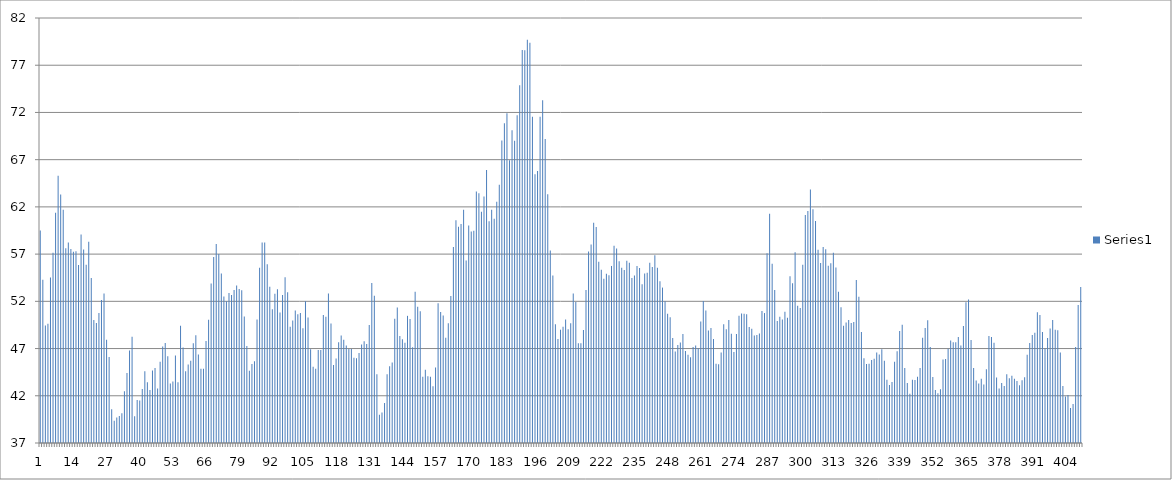
| Category | Series 0 |
|---|---|
| 0 | 59.508 |
| 1 | 54.296 |
| 2 | 49.432 |
| 3 | 49.633 |
| 4 | 54.536 |
| 5 | 57.152 |
| 6 | 61.379 |
| 7 | 65.297 |
| 8 | 63.302 |
| 9 | 61.707 |
| 10 | 57.632 |
| 11 | 58.221 |
| 12 | 57.54 |
| 13 | 57.25 |
| 14 | 57.297 |
| 15 | 55.84 |
| 16 | 59.066 |
| 17 | 57.5 |
| 18 | 55.879 |
| 19 | 58.316 |
| 20 | 54.482 |
| 21 | 50.033 |
| 22 | 49.706 |
| 23 | 50.762 |
| 24 | 52.151 |
| 25 | 52.82 |
| 26 | 47.924 |
| 27 | 46.106 |
| 28 | 40.566 |
| 29 | 39.352 |
| 30 | 39.703 |
| 31 | 39.866 |
| 32 | 40.151 |
| 33 | 42.467 |
| 34 | 44.4 |
| 35 | 46.794 |
| 36 | 48.237 |
| 37 | 39.843 |
| 38 | 41.554 |
| 39 | 41.513 |
| 40 | 42.717 |
| 41 | 44.608 |
| 42 | 43.44 |
| 43 | 42.617 |
| 44 | 44.688 |
| 45 | 44.942 |
| 46 | 42.781 |
| 47 | 45.613 |
| 48 | 47.226 |
| 49 | 47.598 |
| 50 | 46.19 |
| 51 | 43.303 |
| 52 | 43.502 |
| 53 | 46.257 |
| 54 | 43.425 |
| 55 | 49.404 |
| 56 | 47.113 |
| 57 | 44.584 |
| 58 | 45.314 |
| 59 | 45.72 |
| 60 | 47.567 |
| 61 | 48.42 |
| 62 | 46.383 |
| 63 | 44.871 |
| 64 | 44.873 |
| 65 | 47.792 |
| 66 | 50.044 |
| 67 | 53.888 |
| 68 | 56.682 |
| 69 | 58.061 |
| 70 | 57.01 |
| 71 | 54.937 |
| 72 | 52.513 |
| 73 | 52 |
| 74 | 52.88 |
| 75 | 52.667 |
| 76 | 53.192 |
| 77 | 53.684 |
| 78 | 53.305 |
| 79 | 53.161 |
| 80 | 50.381 |
| 81 | 47.28 |
| 82 | 44.662 |
| 83 | 45.36 |
| 84 | 45.647 |
| 85 | 50.073 |
| 86 | 55.546 |
| 87 | 58.233 |
| 88 | 58.242 |
| 89 | 55.933 |
| 90 | 53.532 |
| 91 | 51.174 |
| 92 | 52.815 |
| 93 | 53.286 |
| 94 | 50.81 |
| 95 | 52.676 |
| 96 | 54.55 |
| 97 | 52.969 |
| 98 | 49.314 |
| 99 | 49.959 |
| 100 | 51.023 |
| 101 | 50.641 |
| 102 | 50.776 |
| 103 | 49.14 |
| 104 | 51.996 |
| 105 | 50.294 |
| 106 | 46.938 |
| 107 | 45.064 |
| 108 | 44.87 |
| 109 | 46.834 |
| 110 | 46.857 |
| 111 | 50.547 |
| 112 | 50.359 |
| 113 | 52.828 |
| 114 | 49.662 |
| 115 | 45.266 |
| 116 | 45.947 |
| 117 | 47.674 |
| 118 | 48.373 |
| 119 | 47.928 |
| 120 | 47.312 |
| 121 | 46.945 |
| 122 | 46.944 |
| 123 | 46.028 |
| 124 | 45.978 |
| 125 | 46.525 |
| 126 | 47.442 |
| 127 | 47.783 |
| 128 | 47.494 |
| 129 | 49.491 |
| 130 | 53.952 |
| 131 | 52.594 |
| 132 | 44.28 |
| 133 | 39.992 |
| 134 | 40.225 |
| 135 | 41.248 |
| 136 | 44.273 |
| 137 | 45.136 |
| 138 | 45.523 |
| 139 | 50.16 |
| 140 | 51.351 |
| 141 | 48.339 |
| 142 | 47.974 |
| 143 | 47.608 |
| 144 | 50.464 |
| 145 | 50.127 |
| 146 | 47.131 |
| 147 | 53.003 |
| 148 | 51.416 |
| 149 | 50.958 |
| 150 | 44.017 |
| 151 | 44.754 |
| 152 | 44.058 |
| 153 | 44.005 |
| 154 | 43.001 |
| 155 | 45.004 |
| 156 | 51.8 |
| 157 | 50.864 |
| 158 | 50.513 |
| 159 | 48.15 |
| 160 | 49.666 |
| 161 | 52.564 |
| 162 | 57.76 |
| 163 | 60.595 |
| 164 | 59.898 |
| 165 | 60.19 |
| 166 | 61.686 |
| 167 | 56.33 |
| 168 | 60.032 |
| 169 | 59.396 |
| 170 | 59.481 |
| 171 | 63.618 |
| 172 | 63.436 |
| 173 | 61.475 |
| 174 | 63.099 |
| 175 | 65.894 |
| 176 | 60.488 |
| 177 | 61.696 |
| 178 | 60.739 |
| 179 | 62.553 |
| 180 | 64.344 |
| 181 | 69.018 |
| 182 | 70.846 |
| 183 | 71.921 |
| 184 | 66.927 |
| 185 | 70.102 |
| 186 | 69 |
| 187 | 71.699 |
| 188 | 74.874 |
| 189 | 78.617 |
| 190 | 78.586 |
| 191 | 79.688 |
| 192 | 79.383 |
| 193 | 71.554 |
| 194 | 65.457 |
| 195 | 65.802 |
| 196 | 71.532 |
| 197 | 73.292 |
| 198 | 69.198 |
| 199 | 63.347 |
| 200 | 57.392 |
| 201 | 54.733 |
| 202 | 49.565 |
| 203 | 48.005 |
| 204 | 48.996 |
| 205 | 49.316 |
| 206 | 50.082 |
| 207 | 49.034 |
| 208 | 49.674 |
| 209 | 52.82 |
| 210 | 51.937 |
| 211 | 47.574 |
| 212 | 47.566 |
| 213 | 48.956 |
| 214 | 53.21 |
| 215 | 57.278 |
| 216 | 58.018 |
| 217 | 60.314 |
| 218 | 59.863 |
| 219 | 56.184 |
| 220 | 55.334 |
| 221 | 54.401 |
| 222 | 54.928 |
| 223 | 54.77 |
| 224 | 55.746 |
| 225 | 57.892 |
| 226 | 57.588 |
| 227 | 56.24 |
| 228 | 55.556 |
| 229 | 55.32 |
| 230 | 56.299 |
| 231 | 56.09 |
| 232 | 54.477 |
| 233 | 54.745 |
| 234 | 55.753 |
| 235 | 55.525 |
| 236 | 53.804 |
| 237 | 54.952 |
| 238 | 55.037 |
| 239 | 56.077 |
| 240 | 55.641 |
| 241 | 56.889 |
| 242 | 55.554 |
| 243 | 54.133 |
| 244 | 53.457 |
| 245 | 52.001 |
| 246 | 50.674 |
| 247 | 50.302 |
| 248 | 48.112 |
| 249 | 46.701 |
| 250 | 47.387 |
| 251 | 47.647 |
| 252 | 48.546 |
| 253 | 46.732 |
| 254 | 46.335 |
| 255 | 46.073 |
| 256 | 47.174 |
| 257 | 47.33 |
| 258 | 47.034 |
| 259 | 49.869 |
| 260 | 52.041 |
| 261 | 51.016 |
| 262 | 48.92 |
| 263 | 49.186 |
| 264 | 48.013 |
| 265 | 45.394 |
| 266 | 45.336 |
| 267 | 46.581 |
| 268 | 49.58 |
| 269 | 49.052 |
| 270 | 50.019 |
| 271 | 48.566 |
| 272 | 46.623 |
| 273 | 48.548 |
| 274 | 50.474 |
| 275 | 50.711 |
| 276 | 50.677 |
| 277 | 50.636 |
| 278 | 49.276 |
| 279 | 49.086 |
| 280 | 48.379 |
| 281 | 48.438 |
| 282 | 48.597 |
| 283 | 50.979 |
| 284 | 50.762 |
| 285 | 57.102 |
| 286 | 61.261 |
| 287 | 55.982 |
| 288 | 53.187 |
| 289 | 49.931 |
| 290 | 50.371 |
| 291 | 50.085 |
| 292 | 50.891 |
| 293 | 50.272 |
| 294 | 54.652 |
| 295 | 53.92 |
| 296 | 57.208 |
| 297 | 51.533 |
| 298 | 51.284 |
| 299 | 55.864 |
| 300 | 61.149 |
| 301 | 61.56 |
| 302 | 63.85 |
| 303 | 61.76 |
| 304 | 60.519 |
| 305 | 57.452 |
| 306 | 56.067 |
| 307 | 57.764 |
| 308 | 57.52 |
| 309 | 55.778 |
| 310 | 56.044 |
| 311 | 57.145 |
| 312 | 55.576 |
| 313 | 53.01 |
| 314 | 51.372 |
| 315 | 49.413 |
| 316 | 49.746 |
| 317 | 50.028 |
| 318 | 49.7 |
| 319 | 49.821 |
| 320 | 54.249 |
| 321 | 52.479 |
| 322 | 48.752 |
| 323 | 45.965 |
| 324 | 45.354 |
| 325 | 45.396 |
| 326 | 45.776 |
| 327 | 45.916 |
| 328 | 46.591 |
| 329 | 46.367 |
| 330 | 46.94 |
| 331 | 45.706 |
| 332 | 43.706 |
| 333 | 43.14 |
| 334 | 43.47 |
| 335 | 45.607 |
| 336 | 46.728 |
| 337 | 48.847 |
| 338 | 49.517 |
| 339 | 44.954 |
| 340 | 43.366 |
| 341 | 42.21 |
| 342 | 43.704 |
| 343 | 43.665 |
| 344 | 44.004 |
| 345 | 44.939 |
| 346 | 48.152 |
| 347 | 49.182 |
| 348 | 49.993 |
| 349 | 47.164 |
| 350 | 43.976 |
| 351 | 42.612 |
| 352 | 42.265 |
| 353 | 42.689 |
| 354 | 45.847 |
| 355 | 45.906 |
| 356 | 46.987 |
| 357 | 47.861 |
| 358 | 47.659 |
| 359 | 47.657 |
| 360 | 48.225 |
| 361 | 47.321 |
| 362 | 49.38 |
| 363 | 51.895 |
| 364 | 52.183 |
| 365 | 47.908 |
| 366 | 44.952 |
| 367 | 43.63 |
| 368 | 43.29 |
| 369 | 43.804 |
| 370 | 43.186 |
| 371 | 44.806 |
| 372 | 48.317 |
| 373 | 48.21 |
| 374 | 47.618 |
| 375 | 43.938 |
| 376 | 42.776 |
| 377 | 43.361 |
| 378 | 43.024 |
| 379 | 44.281 |
| 380 | 43.867 |
| 381 | 44.122 |
| 382 | 43.808 |
| 383 | 43.562 |
| 384 | 43.123 |
| 385 | 43.65 |
| 386 | 43.958 |
| 387 | 46.348 |
| 388 | 47.581 |
| 389 | 48.435 |
| 390 | 48.663 |
| 391 | 50.843 |
| 392 | 50.566 |
| 393 | 48.747 |
| 394 | 46.994 |
| 395 | 48.12 |
| 396 | 49.134 |
| 397 | 50.036 |
| 398 | 48.985 |
| 399 | 48.933 |
| 400 | 46.587 |
| 401 | 43.033 |
| 402 | 41.912 |
| 403 | 42.081 |
| 404 | 40.706 |
| 405 | 41.12 |
| 406 | 47.162 |
| 407 | 51.606 |
| 408 | 53.505 |